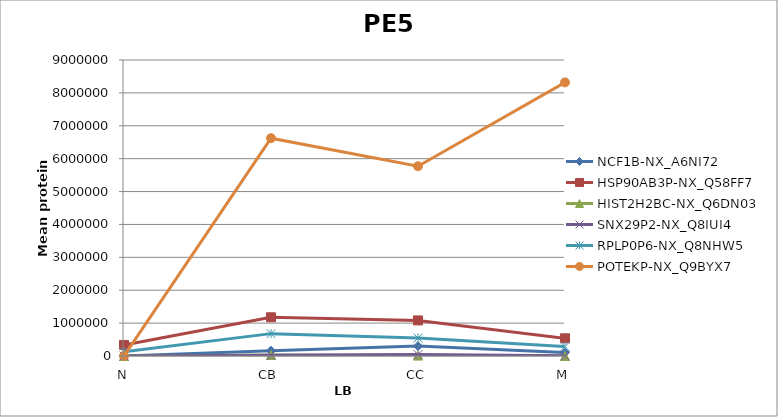
| Category | NCF1B-NX_A6NI72 | HSP90AB3P-NX_Q58FF7 | HIST2H2BC-NX_Q6DN03 | SNX29P2-NX_Q8IUI4 | RPLP0P6-NX_Q8NHW5 | POTEKP-NX_Q9BYX7 |
|---|---|---|---|---|---|---|
| N | 0 | 336121.067 | 556.008 | 0 | 131569.63 | 0 |
| CB | 162451.674 | 1177355.99 | 30824.264 | 19711.027 | 680006.259 | 6623161.515 |
| CC | 300270.242 | 1082016.423 | 11987.457 | 43941.341 | 546765.078 | 5769918.467 |
| M | 107967.581 | 537388.546 | 1297.273 | 3879.26 | 287626.534 | 8318947.472 |